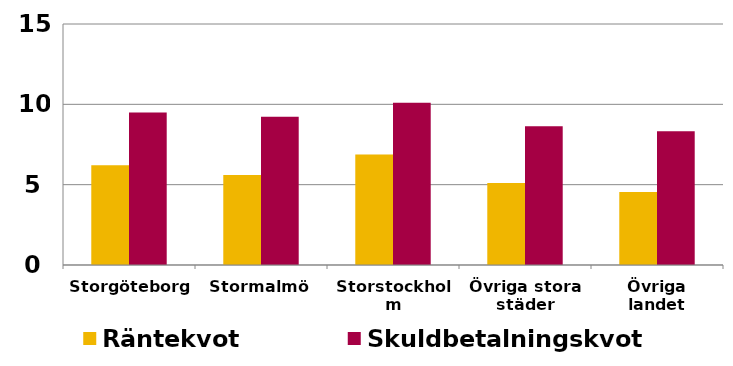
| Category | Räntekvot | Skuldbetalningskvot |
|---|---|---|
| Storgöteborg | 6.206 | 9.496 |
| Stormalmö | 5.598 | 9.227 |
| Storstockholm | 6.88 | 10.099 |
| Övriga stora städer | 5.102 | 8.634 |
| Övriga landet | 4.539 | 8.32 |